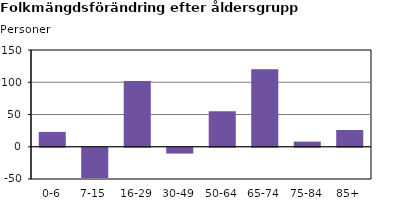
| Category | Series 2 |
|---|---|
| 0-6 | 23 |
| 7-15 | -47 |
| 16-29 | 102 |
| 30-49 | -9 |
| 50-64 | 55 |
| 65-74 | 120 |
| 75-84 | 8 |
| 85+ | 26 |